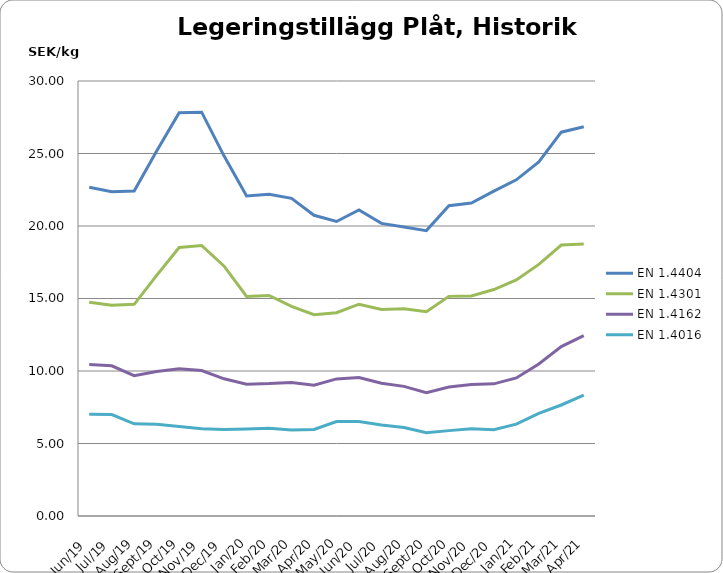
| Category | EN 1.4404 | EN 1.4301 | EN 1.4162  | EN 1.4016 |
|---|---|---|---|---|
| 2019-06-01 | 22.67 | 14.74 | 10.45 | 7.02 |
| 2019-07-01 | 22.36 | 14.54 | 10.36 | 7 |
| 2019-08-01 | 22.42 | 14.6 | 9.68 | 6.36 |
| 2019-09-01 | 25.17 | 16.6 | 9.97 | 6.33 |
| 2019-10-01 | 27.81 | 18.52 | 10.16 | 6.18 |
| 2019-11-01 | 27.85 | 18.66 | 10.03 | 6.01 |
| 2019-12-01 | 24.82 | 17.23 | 9.46 | 5.97 |
| 2020-01-01 | 22.07 | 15.14 | 9.09 | 6 |
| 2020-02-01 | 22.19 | 15.21 | 9.13 | 6.05 |
| 2020-03-01 | 21.911 | 14.462 | 9.207 | 5.938 |
| 2020-04-01 | 20.74 | 13.88 | 9.02 | 5.97 |
| 2020-05-01 | 20.311 | 14.022 | 9.455 | 6.515 |
| 2020-06-01 | 21.105 | 14.607 | 9.554 | 6.524 |
| 2020-07-01 | 20.18 | 14.24 | 9.15 | 6.27 |
| 2020-08-01 | 19.932 | 14.286 | 8.939 | 6.099 |
| 2020-09-01 | 19.682 | 14.092 | 8.509 | 5.737 |
| 2020-10-01 | 21.4 | 15.147 | 8.892 | 5.888 |
| 2020-11-01 | 21.582 | 15.177 | 9.062 | 6.011 |
| 2020-12-01 | 22.402 | 15.617 | 9.115 | 5.945 |
| 2021-01-01 | 23.183 | 16.279 | 9.524 | 6.334 |
| 2021-02-01 | 24.425 | 17.354 | 10.488 | 7.077 |
| 2021-03-01 | 26.469 | 18.69 | 11.679 | 7.656 |
| 2021-04-01 | 26.842 | 18.766 | 12.443 | 8.336 |